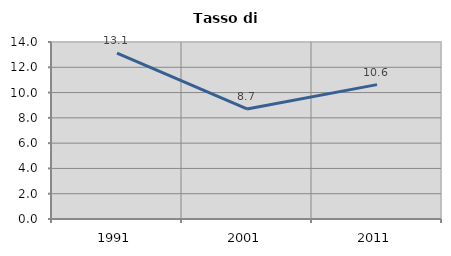
| Category | Tasso di disoccupazione   |
|---|---|
| 1991.0 | 13.111 |
| 2001.0 | 8.705 |
| 2011.0 | 10.63 |